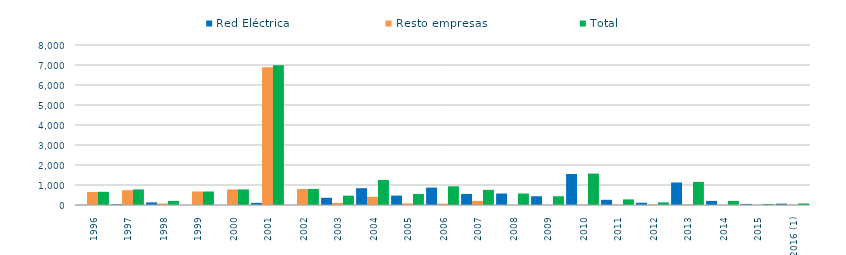
| Category | Red Eléctrica | Resto empresas | Total |
|---|---|---|---|
| 1996 | 7.23 | 653.17 | 660.4 |
| 1997 | 36.95 | 741.45 | 778.4 |
| 1998 | 129.6 | 74.9 | 204.5 |
| 1999 | 0.46 | 675.17 | 675.63 |
| 2000 | 1.4 | 777.91 | 779.31 |
| 2001 | 107.04 | 6883.28 | 6990.32 |
| 2002 | 0.1 | 802.59 | 802.69 |
| 2003 | 360.4 | 105.83 | 466.23 |
| 2004 | 840.46 | 409.19 | 1249.65 |
| 2005 | 469.56 | 79.23 | 548.79 |
| 2006 | 870.41 | 65.39 | 935.8 |
| 2007 | 552.37 | 204.778 | 757.16 |
| 2008 | 573.542 | 0 | 573.542 |
| 2009 | 437.499 | 0 | 437.499 |
| 2010 | 1552.05 | 18.49 | 1570.54 |
| 2011 | 259.46 | 20.23 | 279.69 |
| 2012 | 113.47 | 19.29 | 132.77 |
| 2013 | 1126 | 30.18 | 1156.18 |
| 2014 | 204.346 | 0 | 204.346 |
| 2015 | 52.77 | 0 | 52.77 |
| 2016 (1) | 66.95 | 11.02 | 77.97 |